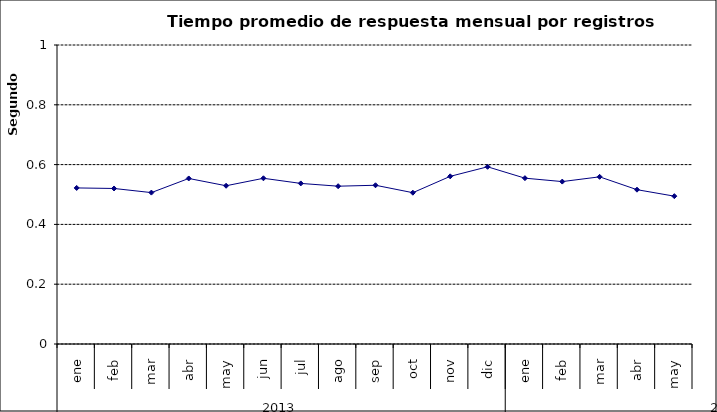
| Category | Tiempo promedio de respuesta por registros cámara PH ** |
|---|---|
| 0 | 0.522 |
| 1 | 0.52 |
| 2 | 0.506 |
| 3 | 0.554 |
| 4 | 0.529 |
| 5 | 0.554 |
| 6 | 0.537 |
| 7 | 0.528 |
| 8 | 0.531 |
| 9 | 0.506 |
| 10 | 0.561 |
| 11 | 0.593 |
| 12 | 0.555 |
| 13 | 0.543 |
| 14 | 0.559 |
| 15 | 0.516 |
| 16 | 0.494 |